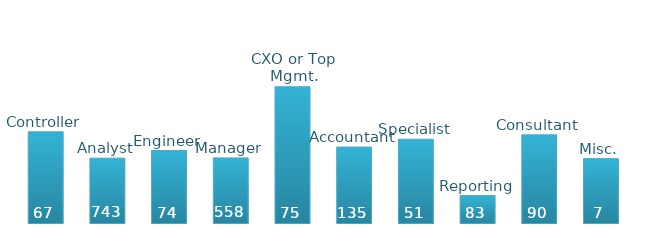
| Category | Monthly Salary |
|---|---|
| Controller | 65103.929 |
| Analyst | 46295.769 |
| Engineer | 51715.151 |
| Manager | 46488.241 |
| CXO or Top Mgmt. | 97265.876 |
| Accountant | 54196.441 |
| Specialist | 59812.969 |
| Reporting | 19574.159 |
| Consultant | 62950.733 |
| Misc. | 45952.334 |